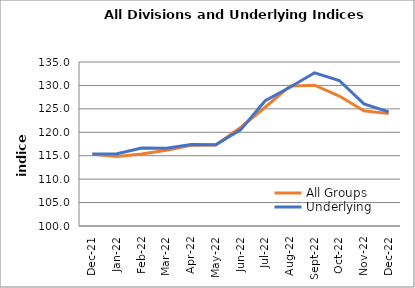
| Category | All Groups | Underlying |
|---|---|---|
| 2021-12-01 | 115.331 | 115.373 |
| 2022-01-01 | 114.841 | 115.444 |
| 2022-02-01 | 115.348 | 116.622 |
| 2022-03-01 | 116.161 | 116.584 |
| 2022-04-01 | 117.224 | 117.408 |
| 2022-05-01 | 117.307 | 117.326 |
| 2022-06-01 | 121.013 | 120.516 |
| 2022-07-01 | 125.348 | 126.726 |
| 2022-08-01 | 129.854 | 129.6 |
| 2022-09-01 | 130.056 | 132.699 |
| 2022-10-01 | 127.726 | 131.059 |
| 2022-11-01 | 124.568 | 126.047 |
| 2022-12-01 | 124.011 | 124.359 |